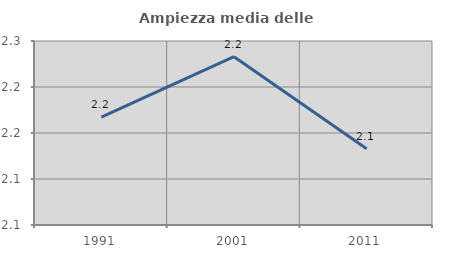
| Category | Ampiezza media delle famiglie |
|---|---|
| 1991.0 | 2.167 |
| 2001.0 | 2.233 |
| 2011.0 | 2.133 |